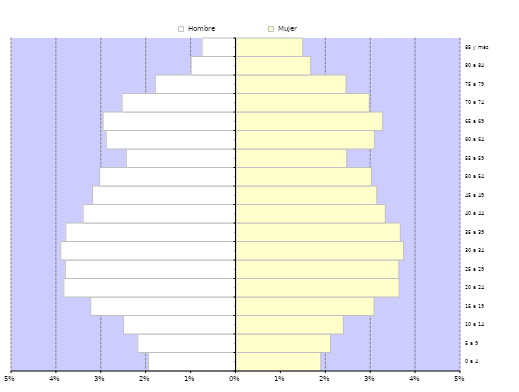
| Category | Hombre | Mujer |
|---|---|---|
| 0 a 4 | -0.02 | 0.019 |
| 5 a 9 | -0.022 | 0.021 |
| 10 a 14 | -0.025 | 0.024 |
| 15 a 19 | -0.032 | 0.031 |
| 20 a 24 | -0.038 | 0.036 |
| 25 a 29 | -0.038 | 0.036 |
| 30 a 34 | -0.039 | 0.037 |
| 35 a 39 | -0.038 | 0.036 |
| 40 a 44 | -0.034 | 0.033 |
| 45 a 49 | -0.032 | 0.031 |
| 50 a 54 | -0.03 | 0.03 |
| 55 a 59 | -0.024 | 0.025 |
| 60 a 64 | -0.029 | 0.031 |
| 65 a 69 | -0.03 | 0.033 |
| 70 a 74 | -0.025 | 0.03 |
| 75 a 79 | -0.018 | 0.024 |
| 80 a 84 | -0.01 | 0.017 |
| 85 y más | -0.008 | 0.015 |